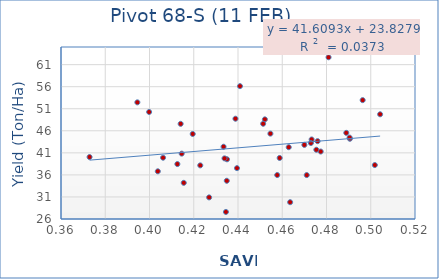
| Category | Series 0 |
|---|---|
| 0.490577 | 44.193 |
| 0.452147 | 48.59 |
| 0.454646 | 45.357 |
| 0.490431 | 44.457 |
| 0.406131 | 39.897 |
| 0.414079 | 47.577 |
| 0.412597 | 38.457 |
| 0.435031 | 39.537 |
| 0.488944 | 45.533 |
| 0.434542 | 27.6 |
| 0.414549 | 40.82 |
| 0.451373 | 47.593 |
| 0.473289 | 44.033 |
| 0.426949 | 30.9 |
| 0.47107 | 36.813 |
| 0.475976 | 35.96 |
| 0.472951 | 43.65 |
| 0.469999 | 43.227 |
| 0.504236 | 42.803 |
| 0.50184 | 49.743 |
| 0.438862 | 38.233 |
| 0.477374 | 48.74 |
| 0.419531 | 41.3 |
| 0.415483 | 45.283 |
| 0.439541 | 34.2 |
| 0.463567 | 40.053 |
| 0.434927 | 37.533 |
| 0.399834 | 29.81 |
| 0.422949 | 34.667 |
| 0.48093 | 50.267 |
| 0.433475 | 38.16 |
| 0.433909 | 39.84 |
| 0.457725 | 62.667 |
| 0.440902 | 42.387 |
| 0.462926 | 39.747 |
| 0.394515 | 35.967 |
| 0.496349 | 56.123 |
| 0.475408 | 42.28 |
| 0.466958 | 52.45 |
| 0.51306 | 52.953 |
| 0.456046 | 41.7 |